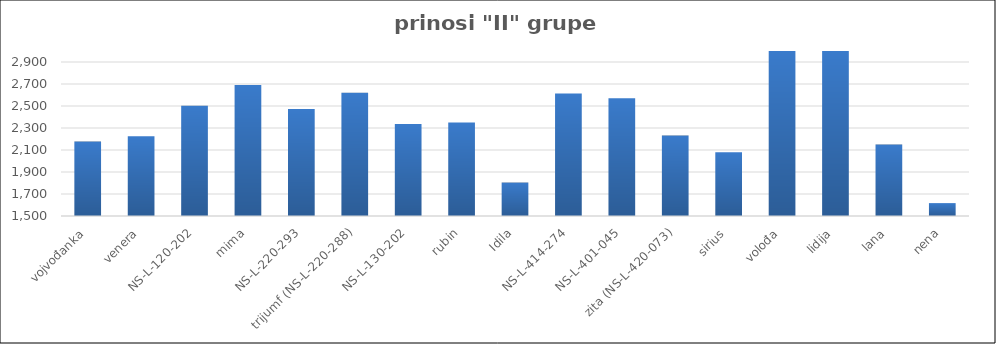
| Category | Series 0 |
|---|---|
| vojvođanka | 2176.988 |
| venera | 2225.3 |
| NS-L-120-202 | 2502.95 |
| mima | 2690.633 |
| NS-L-220-293 | 2473.5 |
| trijumf (NS-L-220-288) | 2621.567 |
| NS-L-130-202 | 2335.5 |
| rubin | 2350.145 |
| Idila | 1804.226 |
| NS-L-414-274 | 2613.821 |
| NS-L-401-045 | 2570.741 |
| zita (NS-L-420-073) | 2231 |
| sirius | 2080 |
| volođa | 3677.223 |
| lidija | 3615.051 |
| lana | 2149.1 |
| nena | 1617.2 |